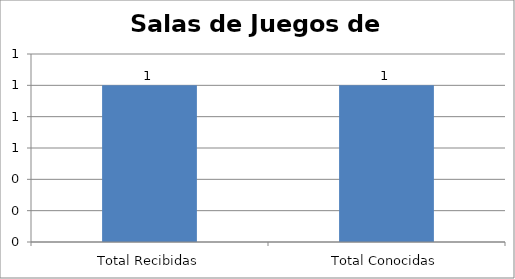
| Category | Series 0 |
|---|---|
| Total Recibidas | 1 |
| Total Conocidas | 1 |